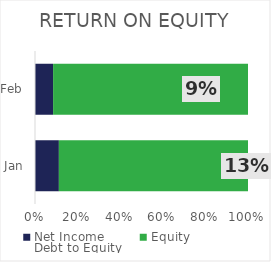
| Category | Net Income | Equity |
|---|---|---|
| Jan | 30.3 | 240 |
| Feb | 25.72 | 277 |